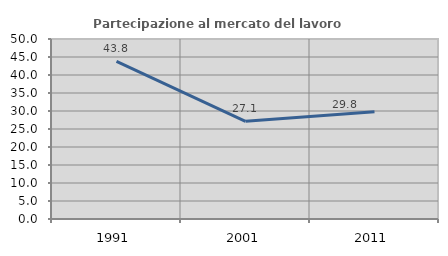
| Category | Partecipazione al mercato del lavoro  femminile |
|---|---|
| 1991.0 | 43.775 |
| 2001.0 | 27.139 |
| 2011.0 | 29.783 |